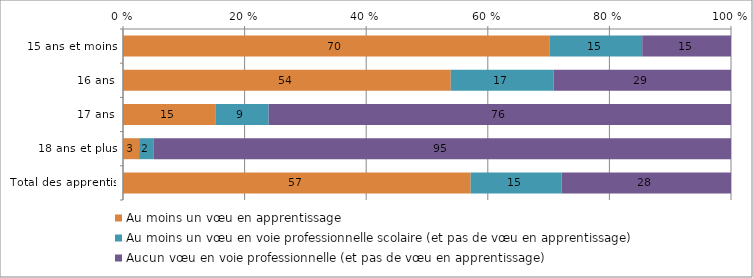
| Category | Au moins un vœu en apprentissage | Au moins un vœu en voie professionnelle scolaire (et pas de vœu en apprentissage) | Aucun vœu en voie professionnelle (et pas de vœu en apprentissage) |
|---|---|---|---|
| 15 ans et moins | 70.122 | 15.275 | 14.603 |
| 16 ans | 53.907 | 16.931 | 29.162 |
| 17 ans | 15.186 | 8.77 | 76.044 |
| 18 ans et plus | 2.653 | 2.417 | 94.929 |
| Total des apprentis | 57.176 | 14.978 | 27.846 |